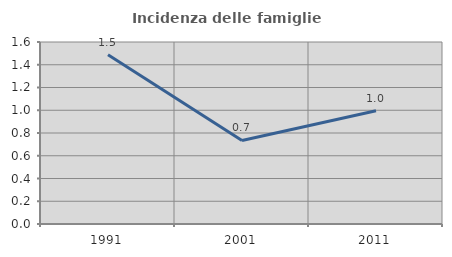
| Category | Incidenza delle famiglie numerose |
|---|---|
| 1991.0 | 1.489 |
| 2001.0 | 0.734 |
| 2011.0 | 0.996 |